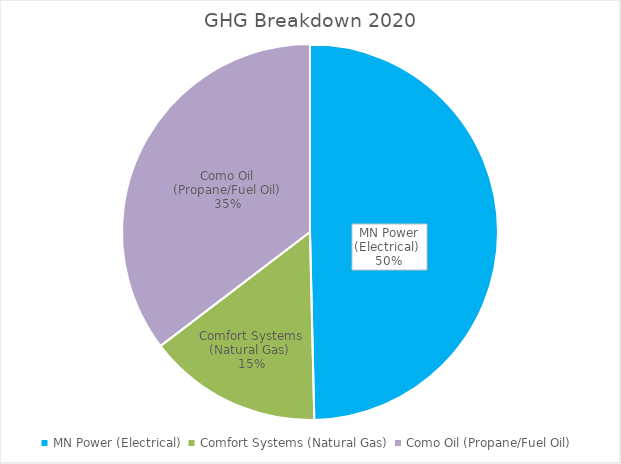
| Category | MN Power (Electrical)  |
|---|---|
| MN Power (Electrical)  | 667.725 |
| Comfort Systems (Natural Gas)  | 201.745 |
| Como Oil (Propane/Fuel Oil) | 475.81 |